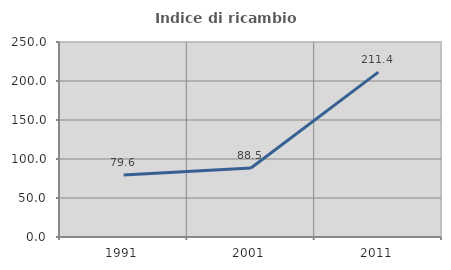
| Category | Indice di ricambio occupazionale  |
|---|---|
| 1991.0 | 79.599 |
| 2001.0 | 88.529 |
| 2011.0 | 211.354 |